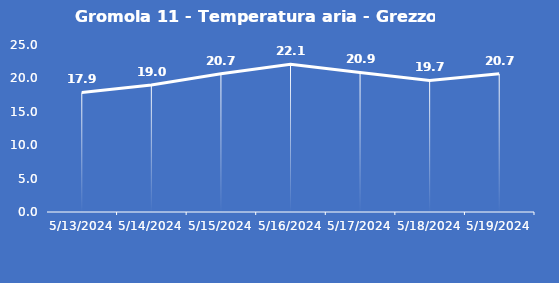
| Category | Gromola 11 - Temperatura aria - Grezzo (°C) |
|---|---|
| 5/13/24 | 17.9 |
| 5/14/24 | 19 |
| 5/15/24 | 20.7 |
| 5/16/24 | 22.1 |
| 5/17/24 | 20.9 |
| 5/18/24 | 19.7 |
| 5/19/24 | 20.7 |